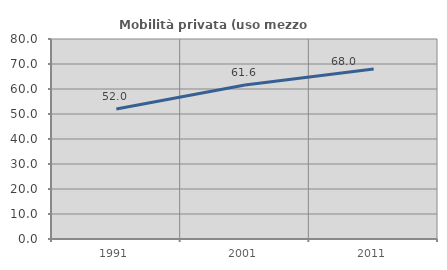
| Category | Mobilità privata (uso mezzo privato) |
|---|---|
| 1991.0 | 52.021 |
| 2001.0 | 61.63 |
| 2011.0 | 68.022 |